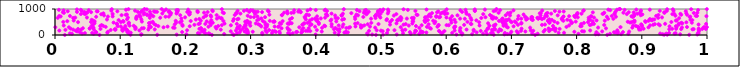
| Category | Series 1 |
|---|---|
| 0.274106642988748 | 1 |
| 0.014959452751224123 | 2 |
| 0.06829250135398923 | 3 |
| 0.24074533904560524 | 4 |
| 0.7364970353312967 | 5 |
| 0.492244781754267 | 6 |
| 0.8470184373582648 | 7 |
| 0.15679604890358434 | 8 |
| 0.9727594681368232 | 9 |
| 0.11585987412325405 | 10 |
| 0.6729278298535781 | 11 |
| 0.9342763728661301 | 12 |
| 0.9390325900839627 | 13 |
| 0.18657739210697344 | 14 |
| 0.13200251233652827 | 15 |
| 0.5031110789257025 | 16 |
| 0.6157326398963283 | 17 |
| 0.48648954483449003 | 18 |
| 0.5241853380109619 | 19 |
| 0.4349123428680999 | 20 |
| 0.39971351313567716 | 21 |
| 0.9851203088698436 | 22 |
| 0.6243076495418984 | 23 |
| 0.4798592274488831 | 24 |
| 0.6892552268844203 | 25 |
| 0.2015163724268909 | 26 |
| 0.1326716887924152 | 27 |
| 0.9588740676374055 | 28 |
| 0.8291692649938651 | 29 |
| 0.8335793652683685 | 30 |
| 0.9318122909966201 | 31 |
| 0.6398147853831485 | 32 |
| 0.27263941515153456 | 33 |
| 0.8683968150289476 | 34 |
| 0.3181772149528014 | 35 |
| 0.3603961291782717 | 36 |
| 0.25952230378543095 | 37 |
| 0.6939623509274219 | 38 |
| 0.5930338771802607 | 39 |
| 0.23722956162498243 | 40 |
| 0.6623744327448499 | 41 |
| 0.879412163969929 | 42 |
| 0.5456562246334263 | 43 |
| 0.0591570320801732 | 44 |
| 0.5587102875089471 | 45 |
| 0.8512101024635358 | 46 |
| 0.8028537415622333 | 47 |
| 0.026051542118249338 | 48 |
| 0.7402601302208068 | 49 |
| 0.6982089713038995 | 50 |
| 0.670354321890488 | 51 |
| 0.6566352008572272 | 52 |
| 0.9375509785058562 | 53 |
| 0.9281254668919239 | 54 |
| 0.950242013890095 | 55 |
| 0.04171732536365991 | 56 |
| 0.6245688083307808 | 57 |
| 0.22143053710758454 | 58 |
| 0.02284551858540773 | 59 |
| 0.7319616060715598 | 60 |
| 0.47870055433747816 | 61 |
| 0.9870747072147884 | 62 |
| 0.8629550117425626 | 63 |
| 0.23583563670616625 | 64 |
| 0.5337969836040642 | 65 |
| 0.27913998280665786 | 66 |
| 0.9518843198694622 | 67 |
| 0.3645945393116927 | 68 |
| 0.2307229269076575 | 69 |
| 0.2192533036105273 | 70 |
| 0.1126783324212105 | 71 |
| 0.04587839689927453 | 72 |
| 0.668757178997663 | 73 |
| 0.3328802904341568 | 74 |
| 0.5092067452088974 | 75 |
| 0.3576547355934572 | 76 |
| 0.29604344136689364 | 77 |
| 0.34483918004953384 | 78 |
| 0.9419103323085333 | 79 |
| 0.05709078196277806 | 80 |
| 0.6092078234993574 | 81 |
| 0.6900259362290803 | 82 |
| 0.31786959852874264 | 83 |
| 0.5515531307085498 | 84 |
| 0.7724352328245665 | 85 |
| 0.7100646952895691 | 86 |
| 0.7807212438218611 | 87 |
| 0.42910951670207 | 88 |
| 0.11612640090646098 | 89 |
| 0.08023649469240124 | 90 |
| 0.5947252844681286 | 91 |
| 0.9865043518594667 | 92 |
| 0.44377560972230035 | 93 |
| 0.37776021099105184 | 94 |
| 0.5695858855853729 | 95 |
| 0.859316050048993 | 96 |
| 0.0632590205250172 | 97 |
| 0.2939179078600799 | 98 |
| 0.2832748345101188 | 99 |
| 0.6467068516151205 | 100 |
| 0.671149120376616 | 101 |
| 0.4492231392768551 | 102 |
| 0.22840802088596224 | 103 |
| 0.8572586451995796 | 104 |
| 0.03804604158590086 | 105 |
| 0.5638894338627913 | 106 |
| 0.32470801447706954 | 107 |
| 0.44663002119658446 | 108 |
| 0.5639180646263716 | 109 |
| 0.8303892442004387 | 110 |
| 0.5442569951719933 | 111 |
| 0.8711148237272702 | 112 |
| 0.19502165940102412 | 113 |
| 0.36997304737395487 | 114 |
| 0.5616555905289954 | 115 |
| 0.8633319032730588 | 116 |
| 0.06277562874534959 | 117 |
| 0.33882703932468416 | 118 |
| 0.3713656404840009 | 119 |
| 0.6216632610531108 | 120 |
| 0.4461664596081184 | 121 |
| 0.7965642913420414 | 122 |
| 0.08111718435117443 | 123 |
| 0.6999256337565426 | 124 |
| 0.43590798804422637 | 125 |
| 0.30327411061349974 | 126 |
| 0.11067155520465066 | 127 |
| 0.5901614423406075 | 128 |
| 0.6799579079453026 | 129 |
| 0.7494059857158991 | 130 |
| 0.8805845827024275 | 131 |
| 0.3795220722344973 | 132 |
| 0.34408300002743464 | 133 |
| 0.4091548858493316 | 134 |
| 0.7214128463879593 | 135 |
| 0.29063151286531486 | 136 |
| 0.8391924317956979 | 137 |
| 0.8113727867547174 | 138 |
| 0.03397749400637606 | 139 |
| 0.2956193601612269 | 140 |
| 0.7082189862875355 | 141 |
| 0.26955906308765276 | 142 |
| 0.2248817402395502 | 143 |
| 0.11222282142727502 | 144 |
| 0.8083335982693243 | 145 |
| 0.33708242598397276 | 146 |
| 0.5610845088385219 | 147 |
| 0.502579088273769 | 148 |
| 0.6607812289129628 | 149 |
| 0.7578786650440131 | 150 |
| 0.39151924020729 | 151 |
| 0.5972835027033457 | 152 |
| 0.33373964760565356 | 153 |
| 0.5538759174884559 | 154 |
| 0.7673435899058673 | 155 |
| 0.652906643930163 | 156 |
| 0.6423202353501822 | 157 |
| 0.3846619903145071 | 158 |
| 0.3878415517258782 | 159 |
| 0.5888582362372945 | 160 |
| 0.714724238353892 | 161 |
| 0.48161336802809307 | 162 |
| 0.10371593251087619 | 163 |
| 0.733448623379167 | 164 |
| 0.03181312375039391 | 165 |
| 0.9879617815348726 | 166 |
| 0.4998886901341215 | 167 |
| 0.3230216650473777 | 168 |
| 0.5525912782252248 | 169 |
| 0.2775084458086552 | 170 |
| 0.006604318824681821 | 171 |
| 0.6129838321711205 | 172 |
| 0.22777933589079846 | 173 |
| 0.8207877365647753 | 174 |
| 0.7297670434728604 | 175 |
| 0.1293622026202731 | 176 |
| 0.28455898347187747 | 177 |
| 0.5330520962558688 | 178 |
| 0.6211350018163084 | 179 |
| 0.8624221629687325 | 180 |
| 0.20255126373262133 | 181 |
| 0.5331241507184141 | 182 |
| 0.4933904067614796 | 183 |
| 0.684405027442855 | 184 |
| 0.29464429429489747 | 185 |
| 0.5206709207568974 | 186 |
| 0.10423291922242772 | 187 |
| 0.3599307483613967 | 188 |
| 0.40160961216857693 | 189 |
| 0.32843807367099953 | 190 |
| 0.5105403319661967 | 191 |
| 0.08539547102537337 | 192 |
| 0.7514060928762823 | 193 |
| 0.1101557152739987 | 194 |
| 0.1032297963974389 | 195 |
| 0.01605787424854388 | 196 |
| 0.6703447494670394 | 197 |
| 0.22940793958794325 | 198 |
| 0.6421095262160675 | 199 |
| 0.9872806466441908 | 200 |
| 0.759832998702295 | 201 |
| 0.09278189448808816 | 202 |
| 0.5372184560872821 | 203 |
| 0.03972890815898944 | 204 |
| 0.25429045387025384 | 205 |
| 0.37869046587121036 | 206 |
| 0.027860090330963483 | 207 |
| 0.8959028737485544 | 208 |
| 0.6312406393753345 | 209 |
| 0.1432256342884186 | 210 |
| 0.05971531774421235 | 211 |
| 0.8985121933535625 | 212 |
| 0.43310473348345413 | 213 |
| 0.6752625845072467 | 214 |
| 0.15301418895259633 | 215 |
| 0.09225972323799947 | 216 |
| 0.6820084017489833 | 217 |
| 0.9421337462116166 | 218 |
| 0.9777593508509157 | 219 |
| 0.09162211834217993 | 220 |
| 0.35740969463391836 | 221 |
| 0.4277812983676379 | 222 |
| 0.6734045567850192 | 223 |
| 0.43636041855183905 | 224 |
| 0.9795339199567067 | 225 |
| 0.9603857647475273 | 226 |
| 0.10937356877623172 | 227 |
| 0.12332184409869651 | 228 |
| 0.7635177198388403 | 229 |
| 0.9981243027019164 | 230 |
| 0.7668498362967628 | 231 |
| 0.9927795832027945 | 232 |
| 0.06976218624908304 | 233 |
| 0.03533711406689377 | 234 |
| 0.7739274661171396 | 235 |
| 0.29344326134611165 | 236 |
| 0.22144195786796605 | 237 |
| 0.9526513426909874 | 238 |
| 0.9466178067100814 | 239 |
| 0.6634011926946717 | 240 |
| 0.2877303112542814 | 241 |
| 0.9027458412053011 | 242 |
| 0.7156010539185413 | 243 |
| 0.10385026113732088 | 244 |
| 0.023951162199699727 | 245 |
| 0.5764974049853308 | 246 |
| 0.7677850422014396 | 247 |
| 0.9873425930300302 | 248 |
| 0.7570165849452615 | 249 |
| 0.24747559840140854 | 250 |
| 0.22381622599129358 | 251 |
| 0.053494900442727755 | 252 |
| 0.05315597775240544 | 253 |
| 0.8450969682394577 | 254 |
| 0.27946324488667607 | 255 |
| 0.6645684346873663 | 256 |
| 0.34748496630901626 | 257 |
| 0.13318626014430546 | 258 |
| 0.042833067952589565 | 259 |
| 0.3890683508248016 | 260 |
| 0.22409575731552323 | 261 |
| 0.13612621305004236 | 262 |
| 0.7651091114666473 | 263 |
| 0.38089860451031643 | 264 |
| 0.10638568081568123 | 265 |
| 0.28186719543501915 | 266 |
| 0.12365796759289605 | 267 |
| 0.44685983502402316 | 268 |
| 0.5748798370522994 | 269 |
| 0.4300823278793827 | 270 |
| 0.6216900674829171 | 271 |
| 0.5587299462271993 | 272 |
| 0.3226248802889341 | 273 |
| 0.18339737172713766 | 274 |
| 0.3565305163495589 | 275 |
| 0.05827181272836046 | 276 |
| 0.409616389294862 | 277 |
| 0.612409726866428 | 278 |
| 0.8952415887655957 | 279 |
| 0.4505524489806403 | 280 |
| 0.05896291205578519 | 281 |
| 0.7287339053158769 | 282 |
| 0.8854703111214318 | 283 |
| 0.18111209028129416 | 284 |
| 0.4910637540538815 | 285 |
| 0.832949693638138 | 286 |
| 0.4694159958135894 | 287 |
| 0.9616143775962711 | 288 |
| 0.9947323763974891 | 289 |
| 0.6944832182019489 | 290 |
| 0.14452148661801367 | 291 |
| 0.9532084964940931 | 292 |
| 0.2801089246006757 | 293 |
| 0.9102039967738744 | 294 |
| 0.02136089336057201 | 295 |
| 0.1664495748872824 | 296 |
| 0.37464112756286905 | 297 |
| 0.4525137599065341 | 298 |
| 0.0005195514253661937 | 299 |
| 0.9999125965454894 | 300 |
| 0.5302820040912776 | 301 |
| 0.4696409434375103 | 302 |
| 0.9959480159731571 | 303 |
| 0.8673281334661417 | 304 |
| 0.14701731841564103 | 305 |
| 0.9693331943620377 | 306 |
| 0.12314274274180914 | 307 |
| 0.8945872416503562 | 308 |
| 0.6125658949992635 | 309 |
| 0.24634835807091215 | 310 |
| 0.784448274135892 | 311 |
| 0.07774274973609907 | 312 |
| 0.5705236005764699 | 313 |
| 0.28992782110247317 | 314 |
| 0.34227514245087 | 315 |
| 0.44095088197715215 | 316 |
| 0.2353601339028929 | 317 |
| 0.5865177966582971 | 318 |
| 0.39886712592428 | 319 |
| 0.692440067978494 | 320 |
| 0.8938209279089868 | 321 |
| 0.32495017916708924 | 322 |
| 0.17269826546028588 | 323 |
| 0.4831227488632718 | 324 |
| 0.3368994673354283 | 325 |
| 0.46083239013457034 | 326 |
| 0.6738851986460761 | 327 |
| 0.6138498545820944 | 328 |
| 0.10094934764882679 | 329 |
| 0.3163048980170545 | 330 |
| 0.4243508552595977 | 331 |
| 0.3435307850557333 | 332 |
| 0.9425295233565142 | 333 |
| 0.7033419688916462 | 334 |
| 0.09598325724350043 | 335 |
| 0.20662043219507875 | 336 |
| 0.9004011457432011 | 337 |
| 0.8057310711610998 | 338 |
| 0.4143657400156098 | 339 |
| 0.9522625306468133 | 340 |
| 0.47140682027000413 | 341 |
| 0.15848574047965924 | 342 |
| 0.8076205672768245 | 343 |
| 0.06941823750034037 | 344 |
| 0.5535951856762927 | 345 |
| 0.25037797213815227 | 346 |
| 0.10796037689164473 | 347 |
| 0.07409917352802886 | 348 |
| 0.28349055637318543 | 349 |
| 0.8906396478385006 | 350 |
| 0.7638377743818774 | 351 |
| 0.05611993600196774 | 352 |
| 0.1957127012320975 | 353 |
| 0.6663699043903561 | 354 |
| 0.12070887109887596 | 355 |
| 0.6879464362732296 | 356 |
| 0.29954126216619326 | 357 |
| 0.4130678234803816 | 358 |
| 0.11438448069859497 | 359 |
| 0.29247249060247815 | 360 |
| 0.8866608183615863 | 361 |
| 0.5426899651275624 | 362 |
| 0.14461079570328172 | 363 |
| 0.6511182423022859 | 364 |
| 0.6730115896751753 | 365 |
| 0.013435886971400746 | 366 |
| 0.788451526395275 | 367 |
| 0.5882609188610965 | 368 |
| 0.9126811188124273 | 369 |
| 0.4351018592649625 | 370 |
| 0.4744075995763135 | 371 |
| 0.26978796966824037 | 372 |
| 0.927688584970585 | 373 |
| 0.3912409923677326 | 374 |
| 0.46895380467958847 | 375 |
| 0.6039429242419916 | 376 |
| 0.5623445577506545 | 377 |
| 0.23866873399492927 | 378 |
| 0.25580720988924954 | 379 |
| 0.6006212302388662 | 380 |
| 0.3141215240633711 | 381 |
| 0.1546154536326827 | 382 |
| 0.82031114508304 | 383 |
| 0.07143402667970478 | 384 |
| 0.8998281168154427 | 385 |
| 0.8423905307672095 | 386 |
| 0.5883015196551158 | 387 |
| 0.9562143119900831 | 388 |
| 0.7468875209871791 | 389 |
| 0.627523852769486 | 390 |
| 0.21384828903884512 | 391 |
| 0.7100517386546058 | 392 |
| 0.1953152994597911 | 393 |
| 0.9174582117119411 | 394 |
| 0.3792414868784839 | 395 |
| 0.32287782280012367 | 396 |
| 0.32562202880905744 | 397 |
| 0.2917660416369915 | 398 |
| 0.5346195868518916 | 399 |
| 0.5138541464169722 | 400 |
| 0.75150164288214 | 401 |
| 0.6756483065975089 | 402 |
| 0.8228024884613736 | 403 |
| 0.9870482947426059 | 404 |
| 0.3934349907161322 | 405 |
| 0.058580674887255935 | 406 |
| 0.18364615170305865 | 407 |
| 0.6880198371944937 | 408 |
| 0.4422129841210247 | 409 |
| 0.8991081448776075 | 410 |
| 0.5730117056235158 | 411 |
| 0.6914858161114393 | 412 |
| 0.47953157610379493 | 413 |
| 0.925624001483442 | 414 |
| 0.31201719456544774 | 415 |
| 0.919944008656418 | 416 |
| 0.42430235983892406 | 417 |
| 0.0952960171915832 | 418 |
| 0.6385834021793132 | 419 |
| 0.5378494676697918 | 420 |
| 0.49617752807475635 | 421 |
| 0.22017923307473541 | 422 |
| 0.40456494170266377 | 423 |
| 0.8071599100960544 | 424 |
| 0.23058551699726848 | 425 |
| 0.998621066499711 | 426 |
| 0.27885806542154135 | 427 |
| 0.826566304654036 | 428 |
| 0.15192473149951813 | 429 |
| 0.637624577581456 | 430 |
| 0.935786181456894 | 431 |
| 0.38143251683002 | 432 |
| 0.3468524174536235 | 433 |
| 0.2981362860548923 | 434 |
| 0.35871796742318796 | 435 |
| 0.09468591315022867 | 436 |
| 0.2599970673452754 | 437 |
| 0.35700100018565384 | 438 |
| 0.460243914986162 | 439 |
| 0.9567685812611583 | 440 |
| 0.7150745502651109 | 441 |
| 0.5480692873459933 | 442 |
| 0.3598328329740652 | 443 |
| 0.22217394600949159 | 444 |
| 0.3080812000197207 | 445 |
| 0.11281758212353132 | 446 |
| 0.9620763532973372 | 447 |
| 0.5237308871416132 | 448 |
| 0.6642348918501221 | 449 |
| 0.6880585496467813 | 450 |
| 0.38246864932580493 | 451 |
| 0.3629720556564878 | 452 |
| 0.06061614307383367 | 453 |
| 0.8253576789928264 | 454 |
| 0.5821316539251802 | 455 |
| 0.792119163780881 | 456 |
| 0.4641191928804952 | 457 |
| 0.3447700811437939 | 458 |
| 0.14411193485768037 | 459 |
| 0.3596955387522337 | 460 |
| 0.3602285642589126 | 461 |
| 0.7153571206909759 | 462 |
| 0.7707674291409345 | 463 |
| 0.8112354439425665 | 464 |
| 0.38731201866358145 | 465 |
| 0.4850971738279153 | 466 |
| 0.7584096038694375 | 467 |
| 0.40470010889091557 | 468 |
| 0.9606546149730745 | 469 |
| 0.24194244032118295 | 470 |
| 0.11354264948402215 | 471 |
| 0.23891982675572132 | 472 |
| 0.9767779658056942 | 473 |
| 0.29406667354826876 | 474 |
| 0.607989027430492 | 475 |
| 0.14640470274464013 | 476 |
| 0.08985344853377142 | 477 |
| 0.7929302980969555 | 478 |
| 0.23751085471398026 | 479 |
| 0.1858846143919779 | 480 |
| 0.8819593470953027 | 481 |
| 0.7069858345012645 | 482 |
| 0.2991914236499317 | 483 |
| 0.32182181893839235 | 484 |
| 0.7582442772046607 | 485 |
| 0.1915684546384916 | 486 |
| 0.968331128342824 | 487 |
| 0.6874246285431161 | 488 |
| 0.650505852927029 | 489 |
| 0.8174474152292522 | 490 |
| 0.7002325837561469 | 491 |
| 0.8842725375160746 | 492 |
| 0.03534057403695101 | 493 |
| 0.39018643313312995 | 494 |
| 0.6142289714828343 | 495 |
| 0.10087988699080852 | 496 |
| 0.055257889380680436 | 497 |
| 0.8886418173769279 | 498 |
| 0.5139436463820899 | 499 |
| 0.9453656310065653 | 500 |
| 0.9057061332587307 | 501 |
| 0.5677210617582886 | 502 |
| 0.012748158547053356 | 503 |
| 0.6857387561267564 | 504 |
| 0.6325964680638674 | 505 |
| 0.4033990797500169 | 506 |
| 0.1498703567927676 | 507 |
| 0.10502584824134942 | 508 |
| 0.8784918997900307 | 509 |
| 0.3346672251929602 | 510 |
| 0.686664207575349 | 511 |
| 0.33661955356860696 | 512 |
| 0.5832428961695136 | 513 |
| 0.29166852008830835 | 514 |
| 0.7987150319345387 | 515 |
| 0.1332960455878467 | 516 |
| 0.765928707968718 | 517 |
| 0.5493352935339147 | 518 |
| 0.2954360206954154 | 519 |
| 0.7052324261840118 | 520 |
| 0.5687213265899193 | 521 |
| 0.4314292349327934 | 522 |
| 0.23270662188841462 | 523 |
| 0.060808861404889836 | 524 |
| 0.568115805730393 | 525 |
| 0.8245722128073194 | 526 |
| 0.3363142364992814 | 527 |
| 0.6988131656363538 | 528 |
| 0.5485006265024939 | 529 |
| 0.8877408649399523 | 530 |
| 0.19422611846690319 | 531 |
| 0.018906074343403745 | 532 |
| 0.34913211552099377 | 533 |
| 0.9053011368314798 | 534 |
| 0.6918523451733666 | 535 |
| 0.31870200039476404 | 536 |
| 0.2081356642016502 | 537 |
| 0.10450892382795829 | 538 |
| 0.25827761295405693 | 539 |
| 0.7559522219788859 | 540 |
| 0.6810440900960764 | 541 |
| 0.2947925650796813 | 542 |
| 0.9102968702018978 | 543 |
| 0.3294304846703213 | 544 |
| 0.1851531407786271 | 545 |
| 0.7797476034085123 | 546 |
| 0.2731216090239179 | 547 |
| 0.888926652751986 | 548 |
| 0.4226290304256727 | 549 |
| 0.8432384250104675 | 550 |
| 0.5799825577052505 | 551 |
| 0.566694070766266 | 552 |
| 0.7903481260712538 | 553 |
| 0.0585049353090793 | 554 |
| 0.22369388053553907 | 555 |
| 0.9522258977737333 | 556 |
| 0.028733124562145718 | 557 |
| 0.40084110171875076 | 558 |
| 0.390945441793325 | 559 |
| 0.8306320910940201 | 560 |
| 0.7562496524527538 | 561 |
| 0.5254170881828097 | 562 |
| 0.5247973408553479 | 563 |
| 0.6462324979401245 | 564 |
| 0.9536455838665095 | 565 |
| 0.9157152784784829 | 566 |
| 0.5303214454063581 | 567 |
| 0.6073732676421855 | 568 |
| 0.3102221104428957 | 569 |
| 0.6907508822630959 | 570 |
| 0.23980081400741893 | 571 |
| 0.097571718798803 | 572 |
| 0.9774411998685493 | 573 |
| 0.5084861386513432 | 574 |
| 0.5718404064356829 | 575 |
| 0.6930055753347307 | 576 |
| 0.5167897527669012 | 577 |
| 0.7326504365139994 | 578 |
| 0.8207269124080212 | 579 |
| 0.7621225027804638 | 580 |
| 0.6386805466289679 | 581 |
| 0.9746802614114342 | 582 |
| 0.05616082269665856 | 583 |
| 0.6127470473498539 | 584 |
| 0.7320754561663174 | 585 |
| 0.8186840281630872 | 586 |
| 0.785737727073388 | 587 |
| 0.44057594220216256 | 588 |
| 0.913916829778721 | 589 |
| 0.4238303352306739 | 590 |
| 0.7226426022269775 | 591 |
| 0.6851566352865717 | 592 |
| 0.7777394511973559 | 593 |
| 0.9165846387334273 | 594 |
| 0.21607480784828992 | 595 |
| 0.07972054889087588 | 596 |
| 0.13250062116378536 | 597 |
| 0.3847066555122268 | 598 |
| 0.9191479932425022 | 599 |
| 0.11045000715307729 | 600 |
| 0.4024574229557142 | 601 |
| 0.36034494860497357 | 602 |
| 0.6960576363243354 | 603 |
| 0.2796990991145919 | 604 |
| 0.758185658616399 | 605 |
| 0.3128149523121371 | 606 |
| 0.509137444992194 | 607 |
| 0.3944036004428756 | 608 |
| 0.5269780690504509 | 609 |
| 0.4433453530249979 | 610 |
| 0.7306821880012585 | 611 |
| 0.9122160523959844 | 612 |
| 0.7468854744839193 | 613 |
| 0.2741420046790327 | 614 |
| 0.5496092969346306 | 615 |
| 0.4604149309334631 | 616 |
| 0.12474524336820125 | 617 |
| 0.7100075777920253 | 618 |
| 0.22141209450191035 | 619 |
| 0.2814166764396715 | 620 |
| 0.8563966142714627 | 621 |
| 0.6713415358982034 | 622 |
| 0.8483539305791002 | 623 |
| 0.7245895922355852 | 624 |
| 0.6285646070781109 | 625 |
| 0.7411727970883377 | 626 |
| 0.7151334065336772 | 627 |
| 0.4847589562927668 | 628 |
| 0.7771272313706266 | 629 |
| 0.6212995173538025 | 630 |
| 0.5397033201751936 | 631 |
| 0.2483070401204973 | 632 |
| 0.39880963768739053 | 633 |
| 0.6062268011306152 | 634 |
| 0.19387377199412914 | 635 |
| 0.6864326609850965 | 636 |
| 0.40780093839327725 | 637 |
| 0.3164411902671188 | 638 |
| 0.7308675806723436 | 639 |
| 0.25520009204569494 | 640 |
| 0.7413599287641948 | 641 |
| 0.2555664218348259 | 642 |
| 0.531234374818178 | 643 |
| 0.9572065426023685 | 644 |
| 0.43373094059047224 | 645 |
| 0.750051481599204 | 646 |
| 0.670049621242118 | 647 |
| 0.7443491721114701 | 648 |
| 0.6767725752477669 | 649 |
| 0.3634757513893627 | 650 |
| 0.4303838739310162 | 651 |
| 0.4916213709342503 | 652 |
| 0.6538822285997801 | 653 |
| 0.6375142465691918 | 654 |
| 0.5473167234428429 | 655 |
| 0.027882505817035108 | 656 |
| 0.38364508828738797 | 657 |
| 0.9251841894367722 | 658 |
| 0.0041805980311138136 | 659 |
| 0.14535906780747165 | 660 |
| 0.7397693477189349 | 661 |
| 0.5501039717090966 | 662 |
| 0.12454045007119419 | 663 |
| 0.5678490674442925 | 664 |
| 0.16138549008129832 | 665 |
| 0.41421541507531834 | 666 |
| 0.8185200163030347 | 667 |
| 0.8268151585106305 | 668 |
| 0.031001641522258372 | 669 |
| 0.11186944658779063 | 670 |
| 0.49906359995189853 | 671 |
| 0.6003879631338851 | 672 |
| 0.049013453896367465 | 673 |
| 0.25174981783354733 | 674 |
| 0.6732005667502385 | 675 |
| 0.9310300462436794 | 676 |
| 0.22785051085146368 | 677 |
| 0.8017836944877225 | 678 |
| 0.19955150515486664 | 679 |
| 0.7222240934585707 | 680 |
| 0.5889502796224609 | 681 |
| 0.5678134092925812 | 682 |
| 0.7319214175201898 | 683 |
| 0.6602448649588569 | 684 |
| 0.32218695803314945 | 685 |
| 0.9736303791205706 | 686 |
| 0.30517177848583155 | 687 |
| 0.7976000570589543 | 688 |
| 0.3000094009760601 | 689 |
| 0.7308342057313928 | 690 |
| 0.5301228822794465 | 691 |
| 0.5906980859514486 | 692 |
| 0.8861989684134087 | 693 |
| 0.47291679111205565 | 694 |
| 0.3829553359533828 | 695 |
| 0.46012993749616515 | 696 |
| 0.7209860058017215 | 697 |
| 0.7794707338665277 | 698 |
| 0.1309962968507966 | 699 |
| 0.5846991006914122 | 700 |
| 0.06308313992891557 | 701 |
| 0.16948651450657082 | 702 |
| 0.8603406995539797 | 703 |
| 0.846396138011234 | 704 |
| 0.576227777716402 | 705 |
| 0.17457498939082217 | 706 |
| 0.9743031701971966 | 707 |
| 0.23947149954208247 | 708 |
| 0.08117723383238362 | 709 |
| 0.12511334915783956 | 710 |
| 0.7800288398272852 | 711 |
| 0.8227456758875552 | 712 |
| 0.008723292208210331 | 713 |
| 0.31047908343832586 | 714 |
| 0.0884333644269033 | 715 |
| 0.40196809926006105 | 716 |
| 0.13012709253843535 | 717 |
| 0.5717832133095995 | 718 |
| 0.8218602507188931 | 719 |
| 0.670023333914104 | 720 |
| 0.884169440230183 | 721 |
| 0.60902412433614 | 722 |
| 0.1507699036254071 | 723 |
| 0.7885852080678226 | 724 |
| 0.9991321093321193 | 725 |
| 0.5847468352309141 | 726 |
| 0.7544811706716645 | 727 |
| 0.4911187500991069 | 728 |
| 0.7108555610658436 | 729 |
| 0.006529688675479761 | 730 |
| 0.8539366992288244 | 731 |
| 0.0228501212143728 | 732 |
| 0.796391750950257 | 733 |
| 0.9846929705084443 | 734 |
| 0.982704221951314 | 735 |
| 0.9220840856015983 | 736 |
| 0.1454311569945177 | 737 |
| 0.4912919273106505 | 738 |
| 0.29556377923687194 | 739 |
| 0.9515710569760815 | 740 |
| 0.23121108697322068 | 741 |
| 0.7521613808621862 | 742 |
| 0.4968117823339925 | 743 |
| 0.8883711438484876 | 744 |
| 0.44000193371623275 | 745 |
| 0.8880332030181712 | 746 |
| 0.5197389544458311 | 747 |
| 0.41780832229547427 | 748 |
| 0.4296816231866579 | 749 |
| 0.23205643505137186 | 750 |
| 0.7448107505062241 | 751 |
| 0.6979015199875293 | 752 |
| 0.07519879226787718 | 753 |
| 0.23864123498833645 | 754 |
| 0.4647371275121862 | 755 |
| 0.771011229088455 | 756 |
| 0.617267796587253 | 757 |
| 0.6912564080327639 | 758 |
| 0.43937936101049213 | 759 |
| 0.8983756239903516 | 760 |
| 0.19203952361263588 | 761 |
| 0.3482453426774289 | 762 |
| 0.6352188674054637 | 763 |
| 0.10210727238245243 | 764 |
| 0.38961744897964545 | 765 |
| 0.24792427955239404 | 766 |
| 0.34785273091556845 | 767 |
| 0.6672272931772936 | 768 |
| 0.2757475775448174 | 769 |
| 0.9255343241340286 | 770 |
| 0.5559944773692921 | 771 |
| 0.3858943409648624 | 772 |
| 0.12945752803423516 | 773 |
| 0.14109479184596385 | 774 |
| 0.14715968260860868 | 775 |
| 0.10843457660117162 | 776 |
| 0.9604229375540859 | 777 |
| 0.969481624888367 | 778 |
| 0.3857664545232027 | 779 |
| 0.3287758511781693 | 780 |
| 0.5545408239783893 | 781 |
| 0.49238547369218666 | 782 |
| 0.17723129118290304 | 783 |
| 0.1414229498628925 | 784 |
| 0.4622469672199694 | 785 |
| 0.20583137907846105 | 786 |
| 0.11031750098769466 | 787 |
| 0.7186870532831137 | 788 |
| 0.41645238391974204 | 789 |
| 0.4155894257963413 | 790 |
| 0.9008144142382767 | 791 |
| 0.8005120416446984 | 792 |
| 0.5744020337551441 | 793 |
| 0.13602488780096178 | 794 |
| 0.8884923406229063 | 795 |
| 0.8002644427103802 | 796 |
| 0.0708304933392826 | 797 |
| 0.4776281652855955 | 798 |
| 0.14680760784838343 | 799 |
| 0.20659602960801293 | 800 |
| 0.6568146407054064 | 801 |
| 0.9468784930908288 | 802 |
| 0.5235398707780317 | 803 |
| 0.876954564769404 | 804 |
| 0.04619855986112431 | 805 |
| 0.4990143867180543 | 806 |
| 0.03962031693206791 | 807 |
| 0.8583266077179669 | 808 |
| 0.5978761278324419 | 809 |
| 0.3070262248125485 | 810 |
| 0.08837554134234937 | 811 |
| 0.8398333092348335 | 812 |
| 0.9592212852361521 | 813 |
| 0.9498069878175432 | 814 |
| 0.631181599484052 | 815 |
| 0.7533166360076301 | 816 |
| 0.8580841323275403 | 817 |
| 0.8075091096527504 | 818 |
| 0.8931617327494438 | 819 |
| 0.44156570040671017 | 820 |
| 0.7610359665242634 | 821 |
| 0.28443239113403396 | 822 |
| 0.4241751384541268 | 823 |
| 0.5917117704438293 | 824 |
| 0.8413980052232466 | 825 |
| 0.18633433301801694 | 826 |
| 0.6015948740953929 | 827 |
| 0.16456650705489506 | 828 |
| 0.04431720131839323 | 829 |
| 0.35661039277824325 | 830 |
| 0.5105097192949047 | 831 |
| 0.47867212127842507 | 832 |
| 0.07422435506786063 | 833 |
| 0.968242479572183 | 834 |
| 0.7435420630154358 | 835 |
| 0.2776918645049007 | 836 |
| 0.7450687057344048 | 837 |
| 0.8969577050893864 | 838 |
| 0.694500509160137 | 839 |
| 0.5782359558676173 | 840 |
| 0.45454302695825843 | 841 |
| 0.048092600784335526 | 842 |
| 0.2589850794291033 | 843 |
| 0.2787086113308066 | 844 |
| 0.17785810044688655 | 845 |
| 0.8013337188949025 | 846 |
| 0.9796902339200052 | 847 |
| 0.755345701234637 | 848 |
| 0.3625578549738534 | 849 |
| 0.9347417224562912 | 850 |
| 0.013692943944031644 | 851 |
| 0.13699524836512778 | 852 |
| 0.6803469547462451 | 853 |
| 0.475531420304666 | 854 |
| 0.9851353801144686 | 855 |
| 0.3063031865955306 | 856 |
| 0.8717847245363788 | 857 |
| 0.8424136908162695 | 858 |
| 0.35134032415421546 | 859 |
| 0.4736725318259014 | 860 |
| 0.22857711527801738 | 861 |
| 0.3661648298322825 | 862 |
| 0.6986399560868743 | 863 |
| 0.1870568099010843 | 864 |
| 0.5943000080755477 | 865 |
| 0.495411198315061 | 866 |
| 0.25730545138775895 | 867 |
| 0.8249316891195901 | 868 |
| 0.8876107542676945 | 869 |
| 0.5859091172841729 | 870 |
| 0.049710460778914944 | 871 |
| 0.206947126738668 | 872 |
| 0.9343746070047807 | 873 |
| 0.01201007032856749 | 874 |
| 0.6306049544249109 | 875 |
| 0.8799251660554993 | 876 |
| 0.05543963008204644 | 877 |
| 0.37690092490510463 | 878 |
| 0.2189371679573242 | 879 |
| 0.3176246440006608 | 880 |
| 0.1314810322310076 | 881 |
| 0.17468264193075345 | 882 |
| 0.23403867772000286 | 883 |
| 0.045356814874806806 | 884 |
| 0.20289922116785908 | 885 |
| 0.6244348305881636 | 886 |
| 0.3054948697865413 | 887 |
| 0.03370017638296152 | 888 |
| 0.12701738771906312 | 889 |
| 0.29800453526445314 | 890 |
| 0.8595049764679631 | 891 |
| 0.15644109990226918 | 892 |
| 0.15363188545024953 | 893 |
| 0.48118649168399164 | 894 |
| 0.3763280965302507 | 895 |
| 0.30745921226312933 | 896 |
| 0.31096528763714115 | 897 |
| 0.3730811991811195 | 898 |
| 0.7737192329041347 | 899 |
| 0.14563069268552165 | 900 |
| 0.5015441931838317 | 901 |
| 0.5976863452187263 | 902 |
| 0.1881165606023376 | 903 |
| 0.7802864934902721 | 904 |
| 0.32783863651842615 | 905 |
| 0.5878850183482662 | 906 |
| 0.5114997320376456 | 907 |
| 0.15174991316109843 | 908 |
| 0.06538807567840987 | 909 |
| 0.3561545016640216 | 910 |
| 0.06409216996301847 | 911 |
| 0.09563555294416926 | 912 |
| 0.019515265016445738 | 913 |
| 0.8980252245456317 | 914 |
| 0.9675068610589349 | 915 |
| 0.4671004382622298 | 916 |
| 0.4953571521551906 | 917 |
| 0.2418932015641143 | 918 |
| 0.672756295870948 | 919 |
| 0.17512983425635464 | 920 |
| 0.41716279862079686 | 921 |
| 0.21846030701014418 | 922 |
| 0.7666958470227847 | 923 |
| 0.6439907295912101 | 924 |
| 0.9382814407678159 | 925 |
| 0.5527937319855615 | 926 |
| 0.1670284325826803 | 927 |
| 0.28009209423283565 | 928 |
| 0.9275888771620016 | 929 |
| 0.04097860184772617 | 930 |
| 0.8101421862327836 | 931 |
| 0.2898166707040657 | 932 |
| 0.9486847601557638 | 933 |
| 0.08641064475890847 | 934 |
| 0.6438051009470929 | 935 |
| 0.13382705374915438 | 936 |
| 0.12275286147446307 | 937 |
| 0.32641854618964206 | 938 |
| 0.6758212758232206 | 939 |
| 0.7472165707568847 | 940 |
| 0.8987708220779954 | 941 |
| 0.47486849265952613 | 942 |
| 0.38729797958066714 | 943 |
| 0.30351510447601693 | 944 |
| 0.8110578754037674 | 945 |
| 0.24127528869378723 | 946 |
| 0.37429584619851775 | 947 |
| 0.013169498951142722 | 948 |
| 0.7031861118351673 | 949 |
| 0.36680892013284216 | 950 |
| 0.41367589631818524 | 951 |
| 0.6217273763573667 | 952 |
| 0.18630603753105457 | 953 |
| 0.3001842715451909 | 954 |
| 0.8516541639911764 | 955 |
| 0.6827565106019892 | 956 |
| 0.0516852418246998 | 957 |
| 0.18847548523295465 | 958 |
| 0.2942574090794512 | 959 |
| 0.9863275093778223 | 960 |
| 0.3998982728136178 | 961 |
| 0.4629997577156284 | 962 |
| 0.4770157633263259 | 963 |
| 0.5411260133042606 | 964 |
| 0.49848668733238366 | 965 |
| 0.8736907024566414 | 966 |
| 0.6297085854851686 | 967 |
| 0.00600476309370801 | 968 |
| 0.039627395446709346 | 969 |
| 0.41472297543874403 | 970 |
| 0.8619448571658269 | 971 |
| 0.10885077418520794 | 972 |
| 0.20414155784480714 | 973 |
| 0.91232815169608 | 974 |
| 0.8485918418292573 | 975 |
| 0.5107755986804302 | 976 |
| 0.8914927152223853 | 977 |
| 0.6593947030292002 | 978 |
| 0.5698165877171145 | 979 |
| 0.17033803631676125 | 980 |
| 0.033652226851063394 | 981 |
| 0.6438874813578642 | 982 |
| 0.5035756099072493 | 983 |
| 0.14086100820096903 | 984 |
| 0.39171644675562955 | 985 |
| 0.6007239258623069 | 986 |
| 0.947605445483648 | 987 |
| 0.5345378807570891 | 988 |
| 0.9388265969852239 | 989 |
| 0.9757885059852159 | 990 |
| 0.25595623016369884 | 991 |
| 0.4428740317344466 | 992 |
| 0.08699369047581973 | 993 |
| 0.11273203647281471 | 994 |
| 0.9997453769472922 | 995 |
| 0.16356137368933532 | 996 |
| 0.8667450552525998 | 997 |
| 0.6771250530390862 | 998 |
| 0.8655175752245573 | 999 |
| 0.13725818629584496 | 1000 |